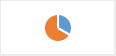
| Category | Section 2.E : Interventions |
|---|---|
| 0 | 0.333 |
| 1 | 0.667 |